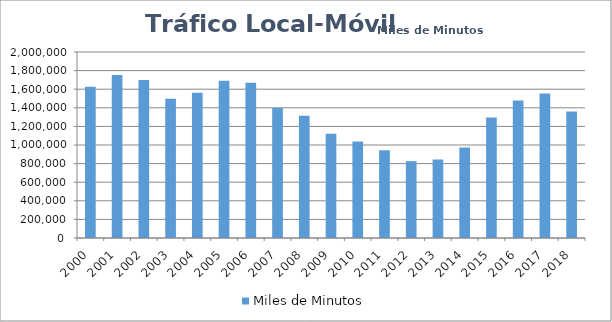
| Category | Miles de Minutos |
|---|---|
| 2000 | 1627028 |
| 2001 | 1752982 |
| 2002 | 1700120 |
| 2003 | 1497591 |
| 2004 | 1562293 |
| 2005 | 1690428 |
| 2006 | 1668463.423 |
| 2007 | 1397811.019 |
| 2008 | 1314507.034 |
| 2009 | 1120321.35 |
| 2010 | 1037043.938 |
| 2011 | 944322.029 |
| 2012 | 826511.145 |
| 2013 | 844044.583 |
| 2014 | 973602.636 |
| 2015 | 1296335.952 |
| 2016 | 1477242.661 |
| 2017 | 1554908.525 |
| 2018 | 1360456.758 |